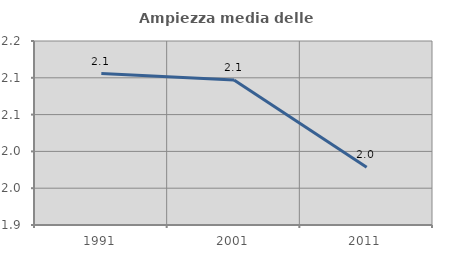
| Category | Ampiezza media delle famiglie |
|---|---|
| 1991.0 | 2.106 |
| 2001.0 | 2.097 |
| 2011.0 | 1.978 |